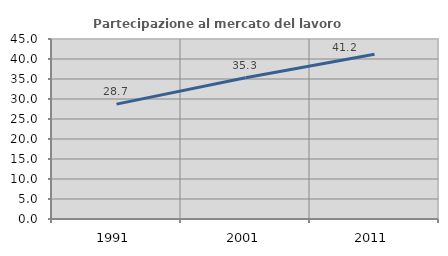
| Category | Partecipazione al mercato del lavoro  femminile |
|---|---|
| 1991.0 | 28.724 |
| 2001.0 | 35.328 |
| 2011.0 | 41.182 |